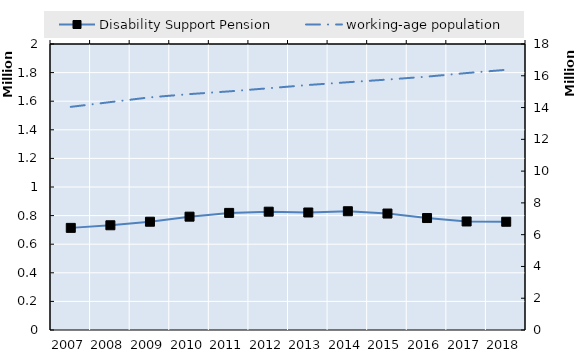
| Category | Disability Support Pension | 0 | Series 14 | Series 15 | Series 16 | Series 17 | Series 18 | Series 19 |
|---|---|---|---|---|---|---|---|---|
| 2007.0 | 714156 |  |  |  |  |  |  |  |
| 2008.0 | 732367 |  |  |  |  |  |  |  |
| 2009.0 | 757118 |  |  |  |  |  |  |  |
| 2010.0 | 792581 |  |  |  |  |  |  |  |
| 2011.0 | 818850 |  |  |  |  |  |  |  |
| 2012.0 | 827460 |  |  |  |  |  |  |  |
| 2013.0 | 821738 |  |  |  |  |  |  |  |
| 2014.0 | 830454 |  |  |  |  |  |  |  |
| 2015.0 | 814391 |  |  |  |  |  |  |  |
| 2016.0 | 782891 |  |  |  |  |  |  |  |
| 2017.0 | 758911 |  |  |  |  |  |  |  |
| 2018.0 | 756960 |  |  |  |  |  |  |  |